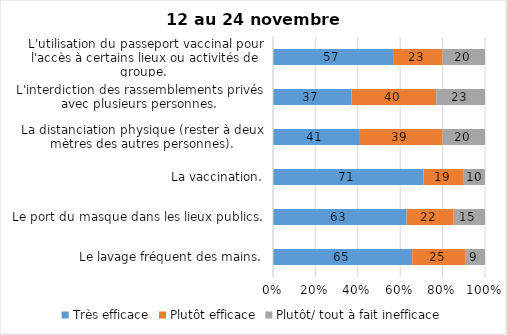
| Category | Très efficace | Plutôt efficace | Plutôt/ tout à fait inefficace |
|---|---|---|---|
| Le lavage fréquent des mains. | 65 | 25 | 9 |
| Le port du masque dans les lieux publics. | 63 | 22 | 15 |
| La vaccination. | 71 | 19 | 10 |
| La distanciation physique (rester à deux mètres des autres personnes). | 41 | 39 | 20 |
| L'interdiction des rassemblements privés avec plusieurs personnes. | 37 | 40 | 23 |
| L'utilisation du passeport vaccinal pour l'accès à certains lieux ou activités de groupe.  | 57 | 23 | 20 |